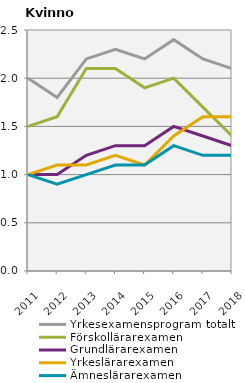
| Category | Yrkesexamensprogram totalt | Förskollärarexamen                                 | Grundlärarexamen                                   | Yrkeslärarexamen                                   | Ämneslärarexamen                                   |
|---|---|---|---|---|---|
| 2011.0 | 2 | 1.5 | 1 | 1 | 1 |
| 2012.0 | 1.8 | 1.6 | 1 | 1.1 | 0.9 |
| 2013.0 | 2.2 | 2.1 | 1.2 | 1.1 | 1 |
| 2014.0 | 2.3 | 2.1 | 1.3 | 1.2 | 1.1 |
| 2015.0 | 2.2 | 1.9 | 1.3 | 1.1 | 1.1 |
| 2016.0 | 2.4 | 2 | 1.5 | 1.4 | 1.3 |
| 2017.0 | 2.2 | 1.7 | 1.4 | 1.6 | 1.2 |
| 2018.0 | 2.1 | 1.4 | 1.3 | 1.6 | 1.2 |